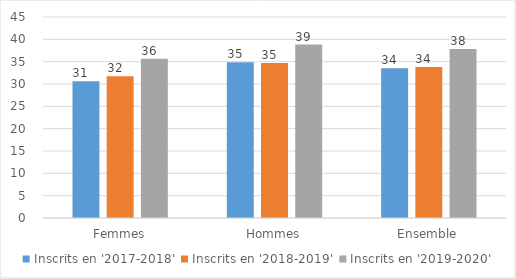
| Category | Inscrits en '2017-2018' | Inscrits en '2018-2019' | Inscrits en '2019-2020' |
|---|---|---|---|
| Femmes | 30.6 | 31.75 | 35.65 |
| Hommes | 34.87 | 34.71 | 38.83 |
| Ensemble | 33.53 | 33.79 | 37.86 |